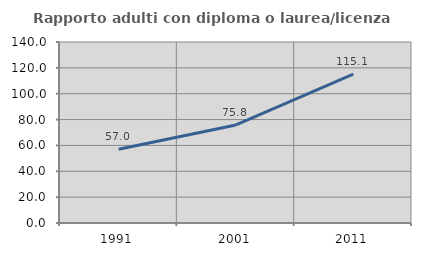
| Category | Rapporto adulti con diploma o laurea/licenza media  |
|---|---|
| 1991.0 | 57.025 |
| 2001.0 | 75.806 |
| 2011.0 | 115.118 |